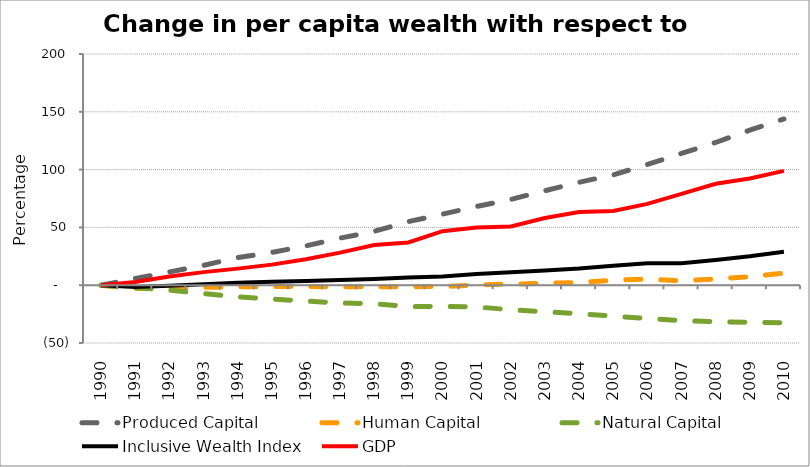
| Category | Produced Capital  | Human Capital | Natural Capital | Inclusive Wealth Index | GDP |
|---|---|---|---|---|---|
| 1990.0 | 0 | 0 | 0 | 0 | 0 |
| 1991.0 | 5.753 | -2.861 | -2.057 | -1.57 | 2.798 |
| 1992.0 | 11.457 | -2.415 | -4.238 | -0.42 | 7.606 |
| 1993.0 | 17.143 | -1.901 | -7.203 | 0.764 | 11.313 |
| 1994.0 | 23.864 | -1.462 | -10.052 | 2.041 | 14.337 |
| 1995.0 | 28.322 | -1.088 | -11.98 | 2.955 | 17.806 |
| 1996.0 | 34.02 | -1.22 | -13.73 | 3.639 | 22.418 |
| 1997.0 | 40.739 | -1.292 | -15.337 | 4.527 | 28.198 |
| 1998.0 | 46.594 | -1.303 | -16.134 | 5.359 | 34.702 |
| 1999.0 | 54.979 | -1.255 | -18.33 | 6.576 | 36.931 |
| 2000.0 | 61.472 | -1.186 | -18.417 | 7.588 | 46.717 |
| 2001.0 | 68.085 | 0.232 | -18.788 | 9.723 | 49.897 |
| 2002.0 | 74.161 | 0.939 | -21.24 | 11.138 | 50.757 |
| 2003.0 | 81.723 | 1.614 | -22.962 | 12.763 | 58.138 |
| 2004.0 | 88.994 | 2.326 | -24.614 | 14.379 | 63.339 |
| 2005.0 | 95.474 | 4.286 | -26.843 | 16.893 | 64.251 |
| 2006.0 | 104.412 | 5.287 | -28.753 | 18.986 | 70.318 |
| 2007.0 | 114.027 | 3.705 | -30.581 | 19.047 | 79.057 |
| 2008.0 | 123.449 | 5.461 | -31.688 | 21.857 | 87.733 |
| 2009.0 | 134.108 | 7.376 | -32.11 | 24.998 | 92.268 |
| 2010.0 | 143.806 | 10.398 | -32.515 | 28.912 | 98.861 |